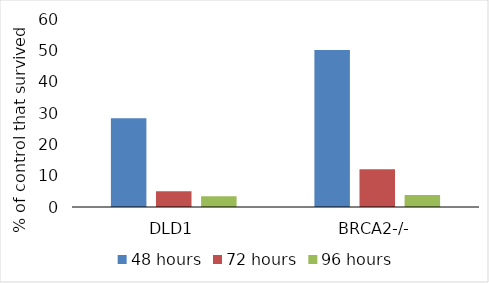
| Category | 48 hours | 72 hours | 96 hours |
|---|---|---|---|
| 0 | 28.336 | 5.025 | 3.45 |
| 1 | 50.128 | 12.046 | 3.833 |